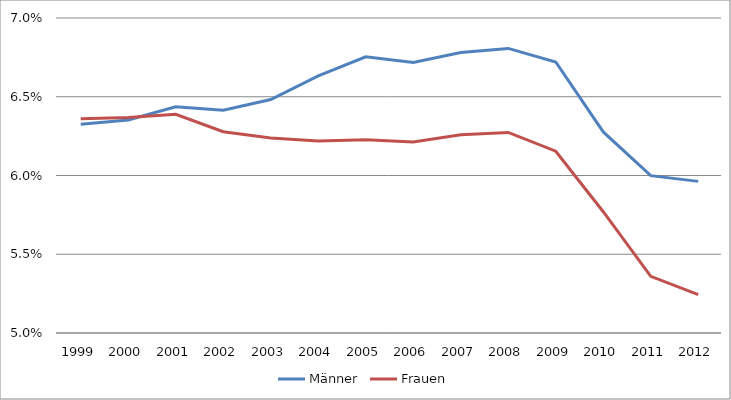
| Category | Männer | Frauen |
|---|---|---|
| 1999.0 | 0.063 | 0.064 |
| 2000.0 | 0.064 | 0.064 |
| 2001.0 | 0.064 | 0.064 |
| 2002.0 | 0.064 | 0.063 |
| 2003.0 | 0.065 | 0.062 |
| 2004.0 | 0.066 | 0.062 |
| 2005.0 | 0.068 | 0.062 |
| 2006.0 | 0.067 | 0.062 |
| 2007.0 | 0.068 | 0.063 |
| 2008.0 | 0.068 | 0.063 |
| 2009.0 | 0.067 | 0.062 |
| 2010.0 | 0.063 | 0.058 |
| 2011.0 | 0.06 | 0.054 |
| 2012.0 | 0.06 | 0.052 |